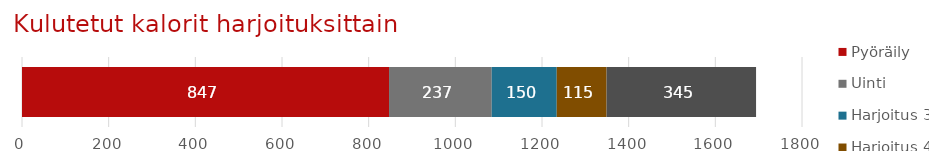
| Category | Pyöräily | Uinti | Harjoitus 3 | Harjoitus 4 | Harjoitus 5 |
|---|---|---|---|---|---|
| Harjoitusseuranta | 847 | 237 | 150 | 115 | 345 |